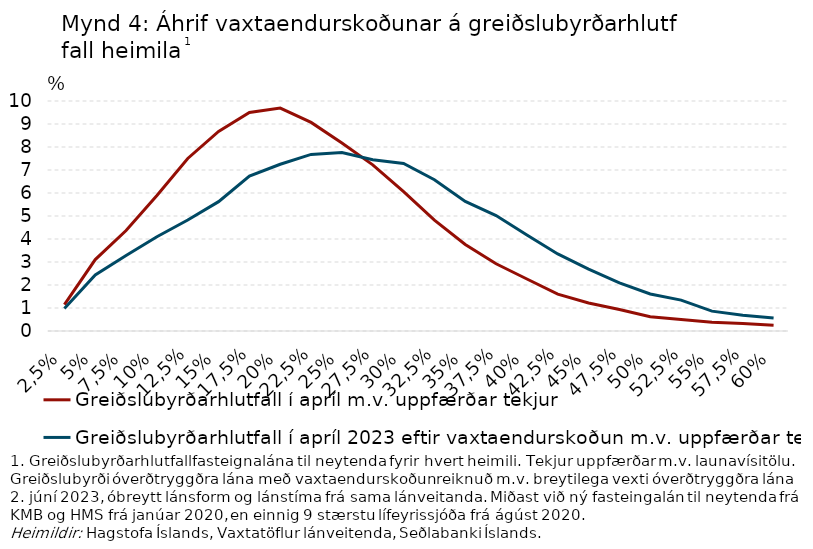
| Category | Greiðslubyrðarhlutfall í apríl m.v. uppfærðar tekjur | Greiðslubyrðarhlutfall í apríl 2023 eftir vaxtaendurskoðun m.v. uppfærðar tekjur |
|---|---|---|
| 2,5% | 1.149 | 0.976 |
| 5% | 3.105 | 2.437 |
| 7,5% | 4.366 | 3.279 |
| 10% | 5.894 | 4.098 |
| 12,5% | 7.503 | 4.827 |
| 15% | 8.676 | 5.624 |
| 17,5% | 9.497 | 6.733 |
| 20% | 9.695 | 7.251 |
| 22,5% | 9.069 | 7.677 |
| 25% | 8.171 | 7.757 |
| 27,5% | 7.224 | 7.444 |
| 30% | 6.056 | 7.287 |
| 32,5% | 4.819 | 6.579 |
| 35% | 3.765 | 5.635 |
| 37,5% | 2.923 | 5.018 |
| 40% | 2.262 | 4.178 |
| 42,5% | 1.6 | 3.352 |
| 45% | 1.216 | 2.691 |
| 47,5% | 0.936 | 2.095 |
| 50% | 0.624 | 1.611 |
| 52,5% | 0.498 | 1.341 |
| 55% | 0.384 | 0.865 |
| 57,5% | 0.321 | 0.685 |
| 60% | 0.249 | 0.561 |